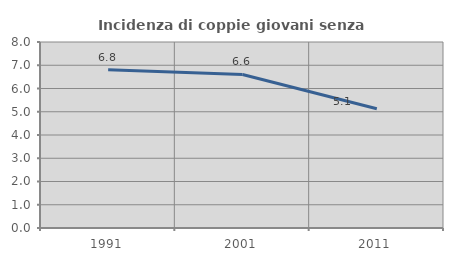
| Category | Incidenza di coppie giovani senza figli |
|---|---|
| 1991.0 | 6.803 |
| 2001.0 | 6.602 |
| 2011.0 | 5.128 |